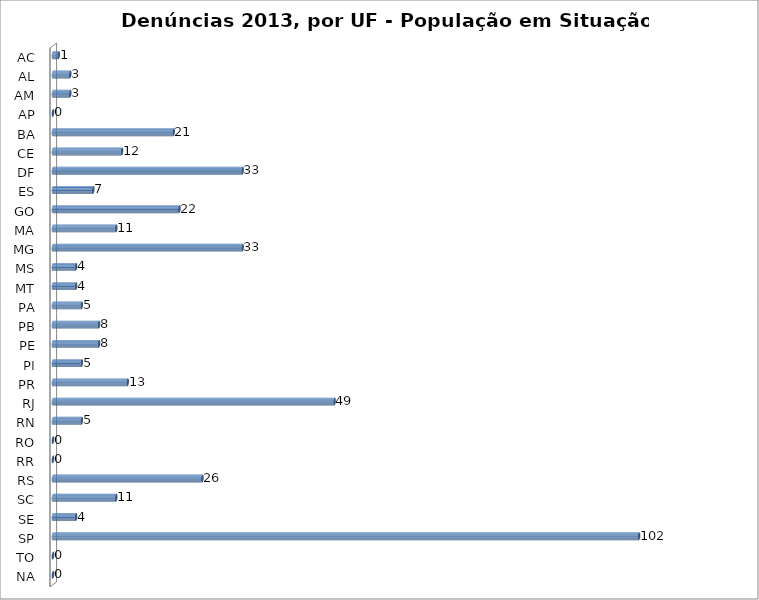
| Category | Series 0 |
|---|---|
| AC | 1 |
| AL | 3 |
| AM | 3 |
| AP | 0 |
| BA | 21 |
| CE | 12 |
| DF | 33 |
| ES | 7 |
| GO | 22 |
| MA | 11 |
| MG | 33 |
| MS | 4 |
| MT | 4 |
| PA | 5 |
| PB | 8 |
| PE | 8 |
| PI | 5 |
| PR | 13 |
| RJ | 49 |
| RN | 5 |
| RO | 0 |
| RR | 0 |
| RS | 26 |
| SC | 11 |
| SE | 4 |
| SP | 102 |
| TO | 0 |
| NA | 0 |